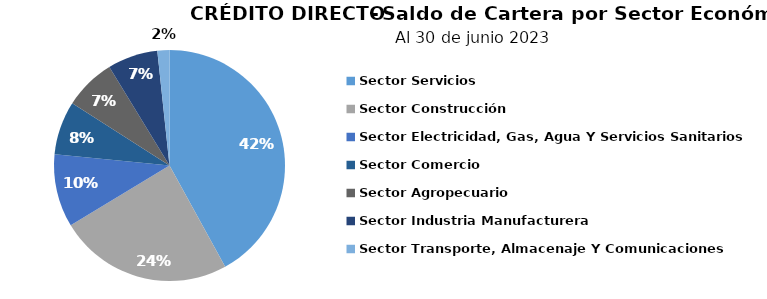
| Category | Saldo |
|---|---|
| Sector Servicios | 82.241 |
| Sector Construcción | 47.66 |
| Sector Electricidad, Gas, Agua Y Servicios Sanitarios | 20.027 |
| Sector Comercio | 14.73 |
| Sector Agropecuario | 14.105 |
| Sector Industria Manufacturera | 13.775 |
| Sector Transporte, Almacenaje Y Comunicaciones | 3.302 |